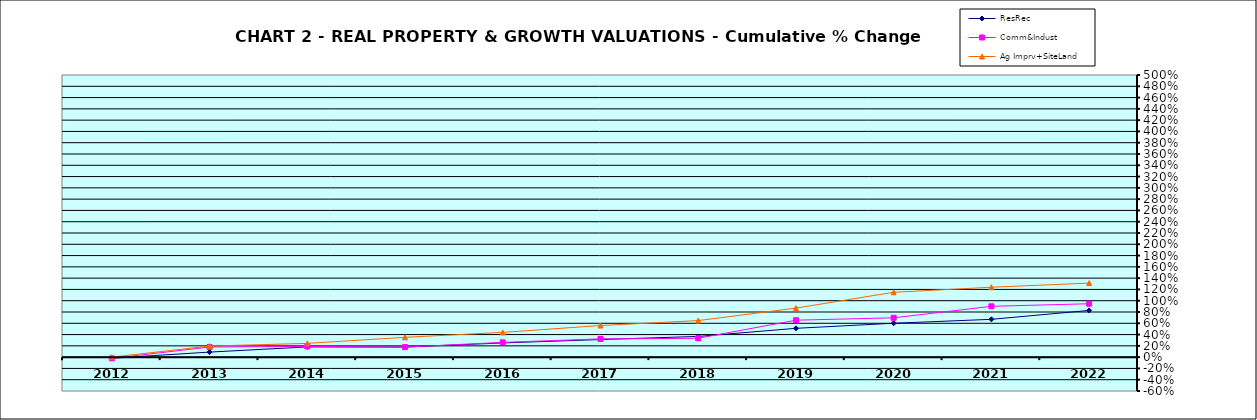
| Category | ResRec | Comm&Indust | Ag Imprv+SiteLand |
|---|---|---|---|
| 2012.0 | -0.019 | -0.022 | 0 |
| 2013.0 | 0.089 | 0.18 | 0.196 |
| 2014.0 | 0.181 | 0.19 | 0.244 |
| 2015.0 | 0.179 | 0.178 | 0.351 |
| 2016.0 | 0.252 | 0.262 | 0.439 |
| 2017.0 | 0.312 | 0.323 | 0.56 |
| 2018.0 | 0.367 | 0.334 | 0.648 |
| 2019.0 | 0.511 | 0.655 | 0.869 |
| 2020.0 | 0.601 | 0.697 | 1.15 |
| 2021.0 | 0.67 | 0.901 | 1.239 |
| 2022.0 | 0.828 | 0.946 | 1.312 |